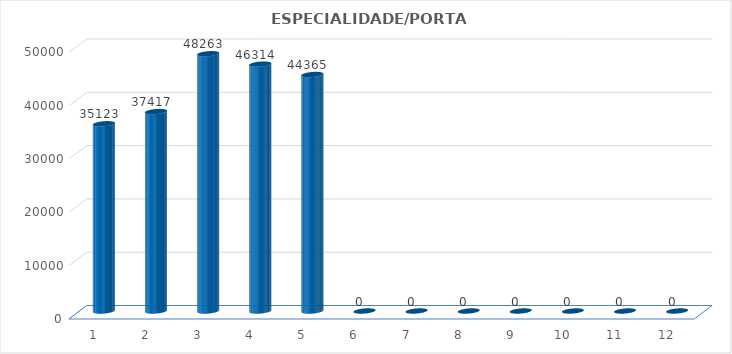
| Category | Series 0 |
|---|---|
| 0 | 35123 |
| 1 | 37417 |
| 2 | 48263 |
| 3 | 46314 |
| 4 | 44365 |
| 5 | 0 |
| 6 | 0 |
| 7 | 0 |
| 8 | 0 |
| 9 | 0 |
| 10 | 0 |
| 11 | 0 |